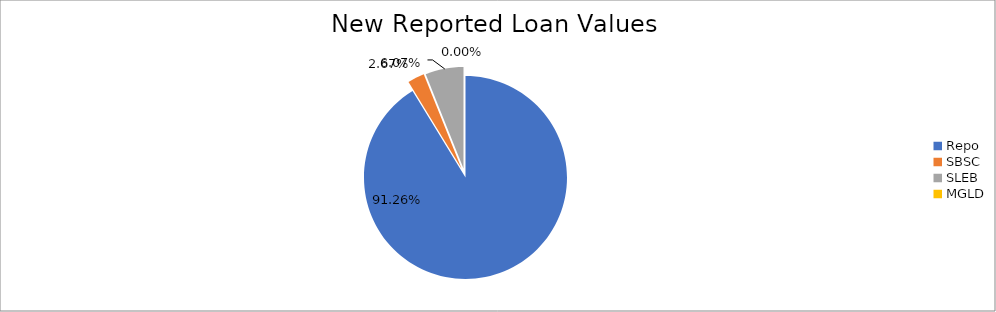
| Category | Series 0 |
|---|---|
| Repo | 8815917.722 |
| SBSC | 258182.317 |
| SLEB | 586023.688 |
| MGLD | 26.475 |